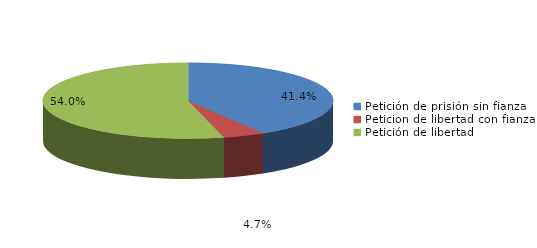
| Category | Series 0 |
|---|---|
| Petición de prisión sin fianza | 151 |
| Peticion de libertad con fianza | 17 |
| Petición de libertad | 197 |